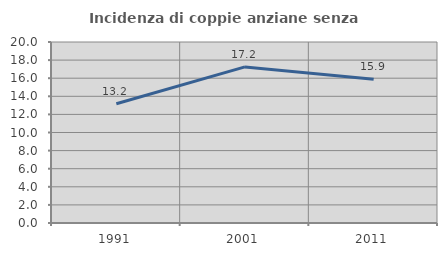
| Category | Incidenza di coppie anziane senza figli  |
|---|---|
| 1991.0 | 13.18 |
| 2001.0 | 17.246 |
| 2011.0 | 15.894 |